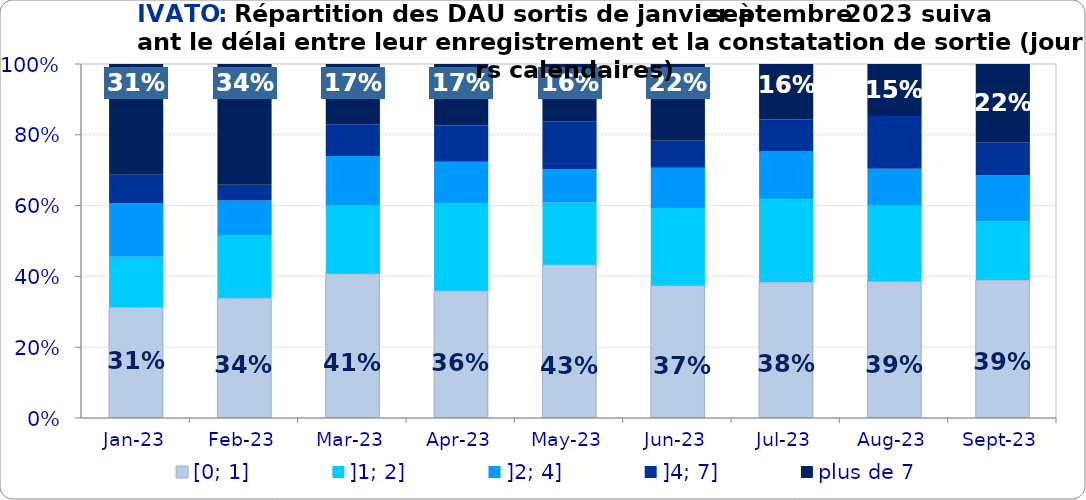
| Category | [0; 1] | ]1; 2] | ]2; 4] | ]4; 7] | plus de 7 |
|---|---|---|---|---|---|
| 2023-01-01 | 0.313 | 0.142 | 0.151 | 0.081 | 0.313 |
| 2023-02-01 | 0.339 | 0.178 | 0.097 | 0.045 | 0.341 |
| 2023-03-01 | 0.408 | 0.194 | 0.139 | 0.09 | 0.17 |
| 2023-04-01 | 0.359 | 0.246 | 0.119 | 0.103 | 0.173 |
| 2023-05-01 | 0.433 | 0.176 | 0.094 | 0.136 | 0.162 |
| 2023-06-01 | 0.374 | 0.219 | 0.114 | 0.076 | 0.217 |
| 2023-07-01 | 0.384 | 0.233 | 0.136 | 0.09 | 0.157 |
| 2023-08-01 | 0.386 | 0.214 | 0.104 | 0.149 | 0.147 |
| 2023-09-01 | 0.39 | 0.165 | 0.131 | 0.093 | 0.221 |